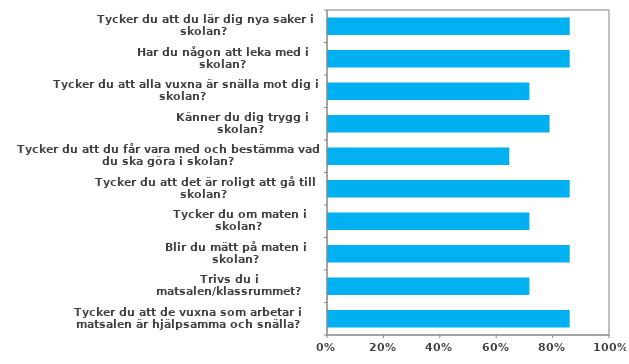
| Category | (Alla) |
|---|---|
| Tycker du att du lär dig nya saker i skolan? | 0.857 |
| Har du någon att leka med i skolan? | 0.857 |
| Tycker du att alla vuxna är snälla mot dig i skolan? | 0.714 |
| Känner du dig trygg i skolan? | 0.786 |
| Tycker du att du får vara med och bestämma vad du ska göra i skolan? | 0.643 |
| Tycker du att det är roligt att gå till skolan? | 0.857 |
| Tycker du om maten i skolan? | 0.714 |
| Blir du mätt på maten i skolan? | 0.857 |
| Trivs du i matsalen/klassrummet? | 0.714 |
| Tycker du att de vuxna som arbetar i matsalen är hjälpsamma och snälla? | 0.857 |